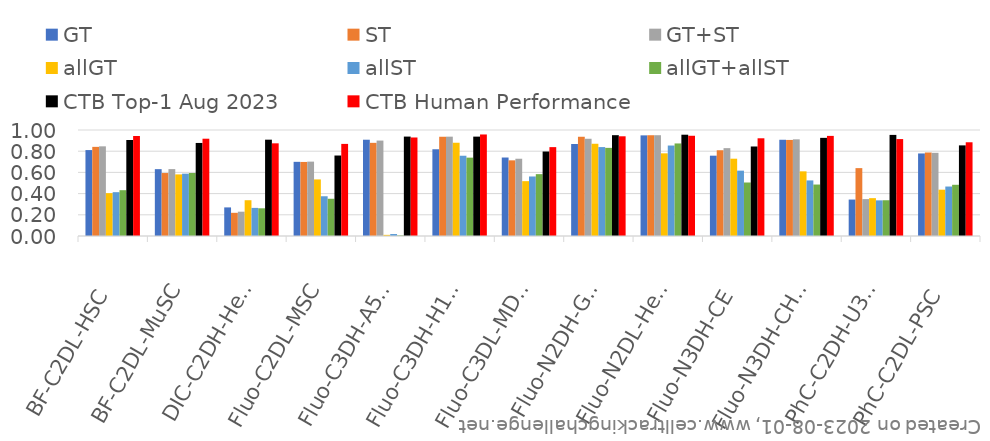
| Category | GT | ST | GT+ST | allGT | allST | allGT+allST | CTB Top-1 Aug 2023 | CTB Human Performance |
|---|---|---|---|---|---|---|---|---|
| BF-C2DL-HSC | 0.811 | 0.841 | 0.846 | 0.404 | 0.413 | 0.432 | 0.906 | 0.944 |
| BF-C2DL-MuSC | 0.631 | 0.594 | 0.631 | 0.581 | 0.588 | 0.595 | 0.878 | 0.918 |
| DIC-C2DH-HeLa | 0.27 | 0.219 | 0.229 | 0.338 | 0.265 | 0.261 | 0.909 | 0.874 |
| Fluo-C2DL-MSC | 0.7 | 0.699 | 0.702 | 0.534 | 0.375 | 0.351 | 0.759 | 0.869 |
| Fluo-C3DH-A549 | 0.908 | 0.879 | 0.9 | 0.011 | 0.019 | 0.006 | 0.938 | 0.929 |
| Fluo-C3DH-H157 | 0.818 | 0.936 | 0.937 | 0.88 | 0.757 | 0.739 | 0.938 | 0.958 |
| Fluo-C3DL-MDA231 | 0.74 | 0.714 | 0.729 | 0.517 | 0.561 | 0.583 | 0.797 | 0.838 |
| Fluo-N2DH-GOWT1 | 0.868 | 0.936 | 0.917 | 0.87 | 0.839 | 0.831 | 0.951 | 0.941 |
| Fluo-N2DL-HeLa | 0.949 | 0.951 | 0.951 | 0.78 | 0.854 | 0.873 | 0.956 | 0.946 |
| Fluo-N3DH-CE | 0.758 | 0.809 | 0.829 | 0.729 | 0.617 | 0.505 | 0.844 | 0.922 |
| Fluo-N3DH-CHO | 0.908 | 0.906 | 0.912 | 0.61 | 0.524 | 0.486 | 0.926 | 0.944 |
| PhC-C2DH-U373 | 0.344 | 0.64 | 0.348 | 0.357 | 0.336 | 0.337 | 0.954 | 0.914 |
| PhC-C2DL-PSC | 0.779 | 0.788 | 0.785 | 0.437 | 0.467 | 0.483 | 0.855 | 0.884 |